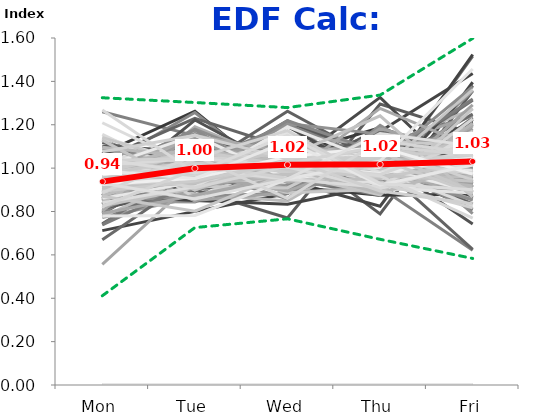
| Category | 1/3/11 | 1/10/11 | 1/17/11 | 1/24/11 | 1/31/11 | 2/7/11 | 2/14/11 | 2/21/11 | 2/28/11 | 3/7/11 | 3/14/11 | 3/21/11 | 3/28/11 | 4/4/11 | 4/11/11 | 4/18/11 | 4/25/11 | 5/2/11 | 5/9/11 | 5/16/11 | 5/23/11 | 5/30/11 | 6/6/11 | 6/13/11 | 6/20/11 | 6/27/11 | 7/4/11 | 7/11/11 | 7/18/11 | 7/25/11 | 8/1/11 | 8/8/11 | 8/15/11 | 8/22/11 | 8/29/11 | 9/5/11 | 9/12/11 | 9/19/11 | 9/26/11 | 10/3/11 | 10/10/11 | 10/17/11 | 10/24/11 | 10/31/11 | 11/7/11 | 11/14/11 | 11/21/11 | 11/28/11 | 12/5/11 | 12/12/11 | 12/19/11 | 12/26/11 | 1/2/12 | 1/9/12 | 1/16/12 | 1/23/12 | 1/30/12 | 2/6/12 | 2/13/12 | 2/20/12 | 2/27/12 | 3/5/12 | 3/12/12 | 3/19/12 | 3/26/12 | 4/2/12 | 4/9/12 | 4/16/12 | 4/23/12 | 4/30/12 | 5/7/12 | 5/14/12 | 5/21/12 | 5/28/12 | 6/4/12 | 6/11/12 | 6/18/12 | 6/25/12 | 7/2/12 | 7/9/12 | 7/16/12 | 7/23/12 | 7/30/12 | 8/6/12 | 8/13/12 | 8/20/12 | 8/27/12 | 9/3/12 | 9/10/12 | 9/17/12 | 9/24/12 | 10/1/12 | 10/8/12 | 10/15/12 | 10/22/12 | 10/29/12 | 11/5/12 | 11/12/12 | 11/19/12 | 11/26/12 | 12/3/12 | 12/10/12 | 12/17/12 | 12/24/12 | 12/31/12 | 1/7/13 | 1/14/13 | 1/21/13 | 1/28/13 | 2/4/13 | 2/11/13 | 2/18/13 | 2/25/13 | 3/4/13 | 3/11/13 | 3/18/13 | 3/25/13 | 4/1/13 | 4/8/13 | 4/15/13 | 4/22/13 | 4/29/13 | 5/6/13 | 5/13/13 | 5/20/13 | 5/27/13 | 6/3/13 | 6/10/13 | 6/17/13 | 6/24/13 | 7/1/13 | 7/8/13 | 7/15/13 | 7/22/13 | 7/29/13 | 8/5/13 | 8/12/13 | 8/19/13 | 8/26/13 | 9/2/13 | 9/9/13 | 9/16/13 | 9/23/13 | 9/30/13 | 10/7/13 | 10/14/13 | 10/21/13 | 10/28/13 | 11/4/13 | 11/11/13 | 11/18/13 | 11/25/13 | 12/2/13 | 12/9/13 | 12/16/13 | 12/23/13 | 12/30/13 | 1/6/14 | 1/13/14 | 1/20/14 | 1/27/14 | 2/3/14 | 2/10/14 | 2/17/14 | 2/24/14 | 3/3/14 | 3/10/14 | 3/17/14 | 3/24/14 | 3/31/14 | 4/7/14 | 4/14/14 | 4/21/14 | 4/28/14 | 5/5/14 | 5/12/14 | 5/19/14 | 5/26/14 | 6/2/14 | 6/9/14 | 6/16/14 | 6/23/14 | 6/30/14 | 7/7/14 | 7/14/14 | 7/21/14 | 7/28/14 | 8/4/14 | 8/11/14 | 8/18/14 | 8/25/14 | 9/1/14 | 9/8/14 | 9/15/14 | 9/22/14 | 9/29/14 | 10/6/14 | 10/13/14 | 10/20/14 | 10/27/14 | 11/3/14 | 11/10/14 | 11/17/14 | 11/24/14 | 12/1/14 | 12/8/14 | 12/15/14 | 12/22/14 | 12/29/14 | 1/5/15 | 1/12/15 | 1/19/15 | 1/26/15 | 2/2/15 | 2/9/15 | 2/16/15 | 2/23/15 | 3/2/15 | 3/9/15 | 3/16/15 | 3/23/15 | 3/30/15 | 4/6/15 | 4/13/15 | 4/20/15 | 4/27/15 | 5/4/15 | 5/11/15 | 5/18/15 | 5/25/15 | 6/1/15 | 6/8/15 | 6/15/15 | 6/22/15 | 6/29/15 | 7/6/15 | 7/13/15 | 7/20/15 | 7/27/15 | 8/3/15 | 8/10/15 | 8/17/15 | 8/24/15 | 8/31/15 | 9/7/15 | 9/14/15 | 9/21/15 | 9/28/15 | 10/5/15 | 10/12/15 | 10/19/15 | Min: | Max: | FINAL: |
|---|---|---|---|---|---|---|---|---|---|---|---|---|---|---|---|---|---|---|---|---|---|---|---|---|---|---|---|---|---|---|---|---|---|---|---|---|---|---|---|---|---|---|---|---|---|---|---|---|---|---|---|---|---|---|---|---|---|---|---|---|---|---|---|---|---|---|---|---|---|---|---|---|---|---|---|---|---|---|---|---|---|---|---|---|---|---|---|---|---|---|---|---|---|---|---|---|---|---|---|---|---|---|---|---|---|---|---|---|---|---|---|---|---|---|---|---|---|---|---|---|---|---|---|---|---|---|---|---|---|---|---|---|---|---|---|---|---|---|---|---|---|---|---|---|---|---|---|---|---|---|---|---|---|---|---|---|---|---|---|---|---|---|---|---|---|---|---|---|---|---|---|---|---|---|---|---|---|---|---|---|---|---|---|---|---|---|---|---|---|---|---|---|---|---|---|---|---|---|---|---|---|---|---|---|---|---|---|---|---|---|---|---|---|---|---|---|---|---|---|---|---|---|---|---|---|---|---|---|---|---|---|---|---|---|---|---|---|---|---|---|---|---|---|---|---|---|---|---|---|---|---|---|---|---|
| Mon | 0.957 | 0.981 | 0 | 0.857 | 1.101 | 0.964 | 0.89 | 0 | 1.068 | 0.998 | 0.744 | 1.131 | 0.857 | 0.892 | 0.879 | 0 | 0.79 | 0.899 | 0.864 | 0.97 | 1.015 | 0 | 0.99 | 0.849 | 0 | 0.92 | 0 | 0.909 | 1.021 | 0.773 | 0.712 | 1.26 | 0.874 | 1 | 0.851 | 0 | 0.932 | 0 | 0.987 | 1.067 | 0.966 | 0.871 | 0.843 | 1.011 | 0.884 | 0.819 | 0 | 0 | 1.019 | 0 | 1.041 | 0 | 0 | 0.893 | 0 | 0.921 | 0.857 | 0.912 | 0.878 | 0 | 0 | 0.932 | 0.669 | 1.009 | 0.915 | 0 | 0.873 | 0.942 | 1.011 | 0.969 | 0.911 | 0.852 | 1.02 | 0 | 1.045 | 0.872 | 0 | 0.903 | 0 | 0.874 | 0.779 | 0.91 | 0.795 | 1.013 | 0.879 | 0.95 | 0.935 | 0 | 0.827 | 0 | 0.86 | 1.028 | 0.739 | 0.882 | 0.942 | 0 | 0.814 | 0.556 | 0 | 0.833 | 0.954 | 0.899 | 0 | 0 | 0 | 0.918 | 0.848 | 0 | 0.862 | 1.039 | 0.738 | 0 | 1.022 | 0.987 | 0 | 1.001 | 0 | 0.853 | 0.887 | 1.139 | 0.885 | 0.833 | 0.929 | 0.83 | 0.891 | 0 | 1.119 | 0.888 | 0 | 0 | 0 | 1.155 | 0.829 | 0.908 | 0.812 | 0.835 | 0.877 | 1.052 | 0.862 | 0 | 0.971 | 0 | 1.04 | 1.209 | 0.85 | 0.775 | 0.928 | 0.92 | 0.858 | 0.815 | 1.006 | 0 | 0.926 | 0.982 | 0 | 0 | 0 | 0.947 | 1.003 | 0 | 1.043 | 1.142 | 0.986 | 0 | 1.057 | 0.98 | 0.937 | 0 | 1.037 | 1.142 | 1.051 | 0 | 0.886 | 1.054 | 0.87 | 0.947 | 1.007 | 0 | 0.884 | 1.032 | 0 | 0 | 0 | 0.93 | 0.844 | 0.923 | 0.791 | 0.979 | 1.01 | 1.089 | 0.945 | 0 | 0.943 | 0 | 0.996 | 0.802 | 0.826 | 0.861 | 0.96 | 0.941 | 0.987 | 1.026 | 0.911 | 0 | 1.096 | 0.928 | 0 | 0 | 0 | 1.005 | 0.872 | 0 | 0.871 | 1.002 | 0.981 | 0 | 0.954 | 0.977 | 0.951 | 0 | 0.946 | 0 | 1.129 | 0.84 | 0.917 | 0.91 | 0.885 | 0.962 | 0.981 | 0 | 0.954 | 0.955 | 0 | 0 | 0 | 0 | 0.987 | 0.894 | 1.01 | 0.924 | 1.036 | 0.779 | 1.268 | 1.075 | 0 | 0 | 0.888 | 0.988 | 1.042 | 0.823 | 0.931 | 0.411 | 1.325 | 0.938 |
| Tue | 1.006 | 0.976 | 0 | 0.961 | 1.078 | 0.926 | 1.014 | 0 | 1.087 | 1.028 | 1.005 | 0.956 | 0.953 | 1.007 | 1.043 | 0 | 1.04 | 0.985 | 0.928 | 1.076 | 1.034 | 0 | 0.98 | 0.843 | 0 | 0.903 | 0 | 1.005 | 1.052 | 0.866 | 0.801 | 1.15 | 0.899 | 1.068 | 0.973 | 0 | 0.906 | 0 | 1.039 | 1.262 | 0.944 | 1.111 | 0.909 | 1.257 | 0.99 | 0.901 | 0 | 0 | 0.895 | 0 | 1.229 | 0 | 0 | 1.073 | 0 | 0.91 | 1.146 | 0.994 | 0.958 | 0 | 0 | 1.161 | 0.963 | 0.975 | 0.894 | 0 | 1.222 | 0.947 | 0.961 | 0.965 | 1.066 | 0.951 | 1.102 | 0 | 0.894 | 0.851 | 0 | 0.881 | 0 | 1.045 | 0.916 | 0.97 | 1.023 | 1.143 | 1.029 | 1.095 | 0.964 | 0 | 0.917 | 0 | 1.074 | 0.945 | 1.032 | 0.918 | 1.025 | 0 | 0.908 | 0.948 | 0 | 0.917 | 1.005 | 1.077 | 0 | 0 | 0 | 1.003 | 0.869 | 0 | 0.986 | 1.07 | 0.935 | 0 | 0.986 | 0.994 | 0 | 1.123 | 0 | 0.957 | 1.015 | 0.863 | 1.016 | 1.191 | 0.987 | 0.982 | 0.956 | 0 | 1.02 | 1.046 | 0 | 0 | 0 | 0.949 | 0.914 | 0.986 | 0.966 | 1.065 | 0.94 | 1.047 | 1.112 | 0 | 1.18 | 0 | 1.037 | 1.006 | 1.093 | 0.971 | 1.087 | 0.93 | 0.98 | 1.026 | 1.025 | 0 | 1.107 | 0.931 | 0 | 0 | 0 | 1.006 | 0.903 | 0 | 0.849 | 1.018 | 1.094 | 0 | 0.851 | 1.176 | 0.996 | 0 | 0.909 | 1.01 | 0.974 | 0 | 1.043 | 0.989 | 1.048 | 0.916 | 1.134 | 0 | 1.091 | 0.955 | 0 | 0 | 0 | 1.138 | 1.058 | 1.008 | 0.875 | 1.05 | 0.928 | 0.996 | 0.992 | 0 | 0.978 | 0 | 1.021 | 1.15 | 0.908 | 0.936 | 1.068 | 0.94 | 1.082 | 0.9 | 0.964 | 0 | 1.05 | 0.965 | 0 | 0 | 0 | 1.152 | 0.997 | 0 | 0.802 | 1.097 | 1.025 | 0 | 0.955 | 0.995 | 1.08 | 0 | 0.975 | 0 | 0.899 | 0.914 | 0.936 | 0.93 | 1.038 | 0.991 | 1.079 | 0 | 1.018 | 0.995 | 0 | 0 | 0 | 0 | 0.909 | 0.94 | 1.047 | 0.954 | 1.045 | 0.781 | 0.979 | 1.151 | 0 | 0 | 1.058 | 0.952 | 0.978 | 0.994 | 0.858 | 0.726 | 1.302 | 0.999 |
| Wed | 0.984 | 0.993 | 0 | 1.052 | 0.925 | 0.998 | 1.015 | 0 | 0.94 | 0.885 | 1.106 | 1.001 | 1.03 | 1.049 | 1.025 | 0 | 1.108 | 1.042 | 1.103 | 0.948 | 1.136 | 0 | 1.057 | 0.991 | 0 | 1.084 | 0 | 0.948 | 0.91 | 1.125 | 0.882 | 1.058 | 0.77 | 0.94 | 1.218 | 0 | 0.942 | 0 | 0.906 | 0.916 | 1.154 | 0.971 | 1.009 | 0.918 | 1.262 | 1.057 | 0 | 0 | 1.139 | 0 | 1.093 | 0 | 0 | 0.987 | 0 | 1.058 | 1.018 | 1.045 | 1.062 | 0 | 0 | 1.009 | 0.931 | 0.98 | 1.023 | 0 | 0.992 | 0.906 | 1.072 | 1.006 | 1.127 | 0.98 | 1.104 | 0 | 1.098 | 0.833 | 0 | 0.849 | 0 | 1.055 | 0.966 | 0.942 | 1.202 | 1.005 | 0.909 | 1.056 | 0.958 | 0 | 0.904 | 0 | 1.056 | 1.035 | 1.019 | 0.963 | 0.977 | 0 | 1.216 | 1.155 | 0 | 0.95 | 1.204 | 1.055 | 0 | 0 | 0 | 1.007 | 0.885 | 0 | 0.96 | 1.017 | 0.973 | 0 | 0.859 | 0.983 | 0 | 1.006 | 0 | 1.192 | 1.056 | 1.037 | 1.028 | 1.017 | 1.109 | 1.057 | 1.206 | 0 | 0.978 | 1.027 | 0 | 0 | 0 | 0.928 | 1.001 | 1.087 | 1.218 | 1.008 | 0.925 | 1.088 | 0.951 | 0 | 1.013 | 0 | 0.984 | 0.963 | 1.075 | 1.033 | 1.027 | 0.943 | 0.909 | 1.039 | 0.986 | 0 | 1.07 | 1.062 | 0 | 0 | 0 | 1.086 | 0.991 | 0 | 1.013 | 0.962 | 0.998 | 0 | 0.886 | 0.926 | 1.011 | 0 | 1.049 | 0.887 | 0.894 | 0 | 1.007 | 1.163 | 1.121 | 0.909 | 0.989 | 0 | 0.972 | 0.933 | 0 | 0 | 0 | 0.933 | 1 | 0.994 | 0.961 | 1.083 | 0.959 | 0.988 | 0.94 | 0 | 0.963 | 0 | 1.043 | 1.074 | 1.088 | 1.192 | 1.034 | 0.981 | 1.009 | 1.025 | 0.973 | 0 | 0.963 | 1.042 | 0 | 0 | 0 | 0.95 | 1.061 | 0 | 0.977 | 1.001 | 0.983 | 0 | 0.971 | 0.949 | 0.992 | 0 | 1.039 | 0 | 1.066 | 1.134 | 1.028 | 1.052 | 1.066 | 1.017 | 1.014 | 0 | 0.953 | 1.082 | 0 | 0 | 0 | 0 | 1.01 | 1.029 | 1.005 | 1.052 | 1.173 | 0.95 | 1.019 | 1.042 | 0 | 0 | 0.859 | 1.123 | 1.151 | 1.021 | 0.949 | 0.766 | 1.279 | 1.015 |
| Thu | 1.022 | 0.979 | 0 | 0.906 | 0.985 | 1.072 | 0.945 | 0 | 0.975 | 1.161 | 0.788 | 0.993 | 1.143 | 1.074 | 0.992 | 0 | 1.094 | 1.086 | 1.092 | 0.942 | 1.007 | 0 | 0.925 | 0.961 | 0 | 1.113 | 0 | 1.001 | 1.155 | 1.042 | 1.169 | 0.911 | 1.296 | 1.05 | 1.017 | 0 | 0.824 | 0 | 0.969 | 0.875 | 0.986 | 0.953 | 1.326 | 1.005 | 1.03 | 1.187 | 0 | 0 | 1.054 | 0 | 1.011 | 0 | 0 | 1.006 | 0 | 1.09 | 0.915 | 1.045 | 1.024 | 0 | 0 | 0.947 | 0.92 | 1.042 | 1.025 | 0 | 0.944 | 1.079 | 0.997 | 1.039 | 0.949 | 1.045 | 1.031 | 0 | 1.077 | 0.92 | 0 | 1.094 | 0 | 1.073 | 1.027 | 1.097 | 1.028 | 0.938 | 1.057 | 1.016 | 0.91 | 0 | 1.109 | 0 | 0.909 | 1.052 | 1.163 | 1.025 | 1.017 | 0 | 1.051 | 1.101 | 0 | 0.919 | 0.938 | 0.988 | 0 | 0 | 0 | 1.12 | 1.023 | 0 | 1.184 | 1.021 | 1.036 | 0 | 1.197 | 1.045 | 0 | 0.973 | 0 | 0.95 | 1.003 | 0.95 | 1.104 | 0.957 | 1.032 | 0.998 | 1.157 | 0 | 0.976 | 1.098 | 0 | 0 | 0 | 1.039 | 1.007 | 1.089 | 1.073 | 1.097 | 1.094 | 0.899 | 0.874 | 0 | 0.983 | 0 | 0.934 | 0.996 | 1.068 | 1.025 | 1.016 | 1.169 | 1.182 | 0.979 | 1.044 | 0 | 0.968 | 1.087 | 0 | 0 | 0 | 0.991 | 0.921 | 0 | 0.896 | 0.931 | 0.987 | 0 | 0.915 | 0.919 | 1.065 | 0 | 1.115 | 0.901 | 1.052 | 0 | 1.017 | 0.909 | 1.024 | 1.126 | 0.969 | 0 | 1.04 | 1.111 | 0 | 0 | 0 | 1.067 | 1.036 | 1.101 | 1.276 | 0.982 | 0.897 | 1.007 | 0.951 | 0 | 0.98 | 0 | 1.04 | 1.01 | 1.061 | 1.024 | 1.052 | 0.911 | 0.961 | 1.03 | 0.877 | 0 | 0.973 | 0.979 | 0 | 0 | 0 | 1.003 | 1.013 | 0 | 0.989 | 0.884 | 1.036 | 0 | 0.986 | 0.911 | 0.959 | 0 | 1.096 | 0 | 0.967 | 0.98 | 1.093 | 1.241 | 1.036 | 0.976 | 1.04 | 0 | 1.014 | 1.076 | 0 | 0 | 0 | 0 | 0.971 | 1.054 | 0.905 | 1.097 | 0.93 | 1.033 | 0.964 | 0.895 | 0 | 0 | 1.127 | 0.922 | 0.928 | 1.101 | 1.16 | 0.672 | 1.337 | 1.017 |
| Fri | 1.031 | 1.071 | 0 | 1.224 | 0.911 | 1.04 | 1.136 | 0 | 0.93 | 0.927 | 1.357 | 0.919 | 1.018 | 0.977 | 1.061 | 0 | 0.968 | 0.988 | 1.013 | 1.064 | 0.809 | 0 | 1.047 | 1.356 | 0 | 0.98 | 0 | 1.137 | 0.862 | 1.194 | 1.436 | 0.621 | 1.16 | 0.942 | 0.941 | 0 | 1.396 | 0 | 1.099 | 0.879 | 0.95 | 1.094 | 0.913 | 0.811 | 0.834 | 1.036 | 0 | 0 | 0.893 | 0 | 0.625 | 0 | 0 | 1.042 | 0 | 1.021 | 1.064 | 1.004 | 1.078 | 0 | 0 | 0.952 | 1.517 | 0.994 | 1.142 | 0 | 0.969 | 1.126 | 0.958 | 1.021 | 0.946 | 1.171 | 0.742 | 0 | 0.886 | 1.524 | 0 | 1.273 | 0 | 0.954 | 1.313 | 1.081 | 0.951 | 0.901 | 1.125 | 0.882 | 1.233 | 0 | 1.243 | 0 | 1.101 | 0.94 | 1.047 | 1.212 | 1.039 | 0 | 1.011 | 1.24 | 0 | 1.381 | 0.9 | 0.981 | 0 | 0 | 0 | 0.952 | 1.375 | 0 | 1.007 | 0.853 | 1.319 | 0 | 0.936 | 0.99 | 0 | 0.896 | 0 | 1.048 | 1.04 | 1.011 | 0.967 | 1.002 | 0.943 | 1.132 | 0.79 | 0 | 0.907 | 0.941 | 0 | 0 | 0 | 0.928 | 1.249 | 0.93 | 0.93 | 0.995 | 1.164 | 0.914 | 1.202 | 0 | 0.853 | 0 | 1.005 | 0.827 | 0.913 | 1.195 | 0.942 | 1.038 | 1.07 | 1.14 | 0.939 | 0 | 0.929 | 0.938 | 0 | 0 | 0 | 0.971 | 1.182 | 0 | 1.199 | 0.947 | 0.934 | 0 | 1.292 | 0.999 | 0.991 | 0 | 0.89 | 1.06 | 1.03 | 0 | 1.048 | 0.885 | 0.938 | 1.102 | 0.901 | 0 | 1.012 | 0.969 | 0 | 0 | 0 | 0.932 | 1.062 | 0.974 | 1.097 | 0.906 | 1.207 | 0.92 | 1.171 | 0 | 1.136 | 0 | 0.9 | 0.965 | 1.117 | 0.988 | 0.886 | 1.227 | 0.961 | 1.019 | 1.275 | 0 | 0.918 | 1.086 | 0 | 0 | 0 | 0.891 | 1.057 | 0 | 1.362 | 1.016 | 0.976 | 0 | 1.134 | 1.168 | 1.018 | 0 | 0.944 | 0 | 0.939 | 1.131 | 1.026 | 0.866 | 0.974 | 1.055 | 0.886 | 0 | 1.061 | 0.892 | 0 | 0 | 0 | 0 | 1.123 | 1.083 | 1.032 | 0.973 | 0.816 | 1.457 | 0.77 | 0.836 | 0 | 0 | 1.068 | 1.015 | 0.9 | 1.06 | 1.103 | 0.583 | 1.598 | 1.031 |